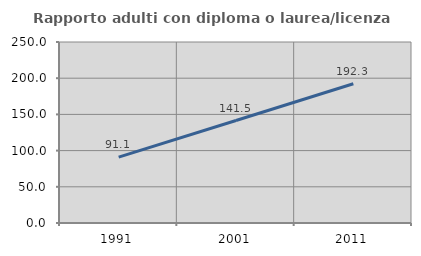
| Category | Rapporto adulti con diploma o laurea/licenza media  |
|---|---|
| 1991.0 | 91.071 |
| 2001.0 | 141.538 |
| 2011.0 | 192.308 |